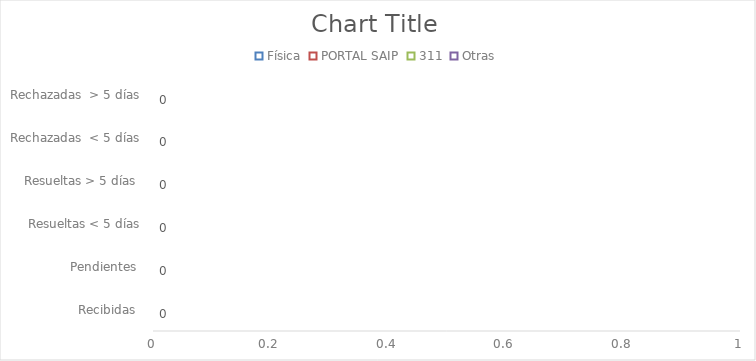
| Category | Física | PORTAL SAIP | 311 | Otras |
|---|---|---|---|---|
| Recibidas  | 0 | 0 | 0 | 0 |
| Pendientes  | 0 | 0 | 0 | 0 |
| Resueltas < 5 días | 0 | 0 | 0 | 0 |
| Resueltas > 5 días  | 0 | 0 | 0 | 0 |
| Rechazadas  < 5 días | 0 | 0 | 0 | 0 |
| Rechazadas  > 5 días | 0 | 0 | 0 | 0 |